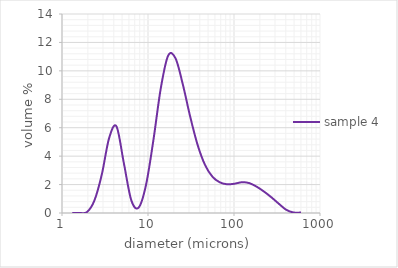
| Category | sample 4 |
|---|---|
| 1.32 | 0 |
| 1.6 | 0 |
| 1.95 | 0.063 |
| 2.38 | 0.876 |
| 2.9 | 2.697 |
| 3.53 | 5.267 |
| 4.3 | 6.09 |
| 5.24 | 3.504 |
| 6.39 | 0.898 |
| 7.78 | 0.379 |
| 9.48 | 1.971 |
| 11.55 | 5.117 |
| 14.08 | 8.773 |
| 17.15 | 11.073 |
| 20.9 | 10.882 |
| 25.46 | 9.022 |
| 31.01 | 6.753 |
| 37.79 | 4.781 |
| 46.03 | 3.382 |
| 56.09 | 2.557 |
| 68.33 | 2.158 |
| 83.26 | 2.02 |
| 101.44 | 2.061 |
| 123.59 | 2.164 |
| 150.57001 | 2.103 |
| 183.44 | 1.852 |
| 223.50999 | 1.504 |
| 272.31 | 1.102 |
| 331.76999 | 0.653 |
| 404.20999 | 0.228 |
| 492.47 | 0.035 |
| 600.0 | 0.031 |